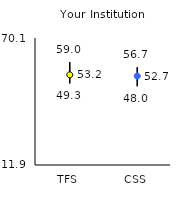
| Category | 25th | 75th | Mean |
|---|---|---|---|
| TFS | 49.3 | 59 | 53.22 |
| CSS | 48 | 56.7 | 52.65 |